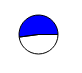
| Category | Series 0 |
|---|---|
| 0 | 38904 |
| 1 | 42374 |